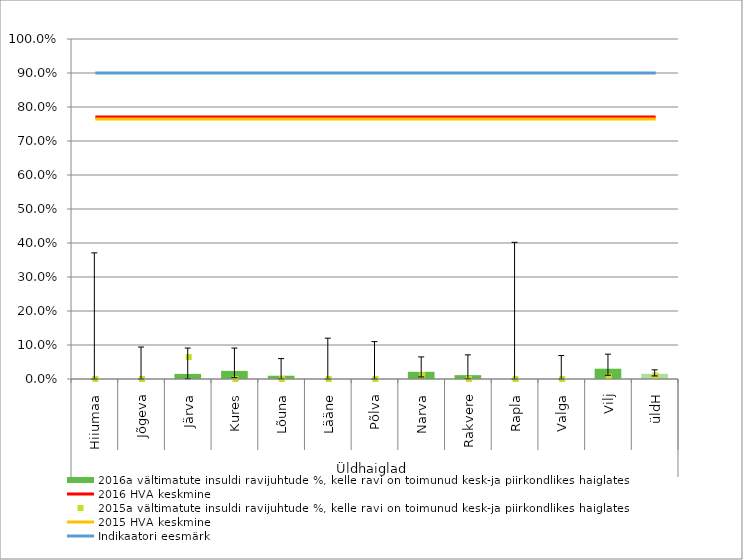
| Category | 2016a vältimatute insuldi ravijuhtude %, kelle ravi on toimunud kesk-ja piirkondlikes haiglates |
|---|---|
| 0 | 0 |
| 1 | 0 |
| 2 | 0.015 |
| 3 | 0.024 |
| 4 | 0.01 |
| 5 | 0 |
| 6 | 0 |
| 7 | 0.021 |
| 8 | 0.011 |
| 9 | 0 |
| 10 | 0 |
| 11 | 0.03 |
| 12 | 0.015 |